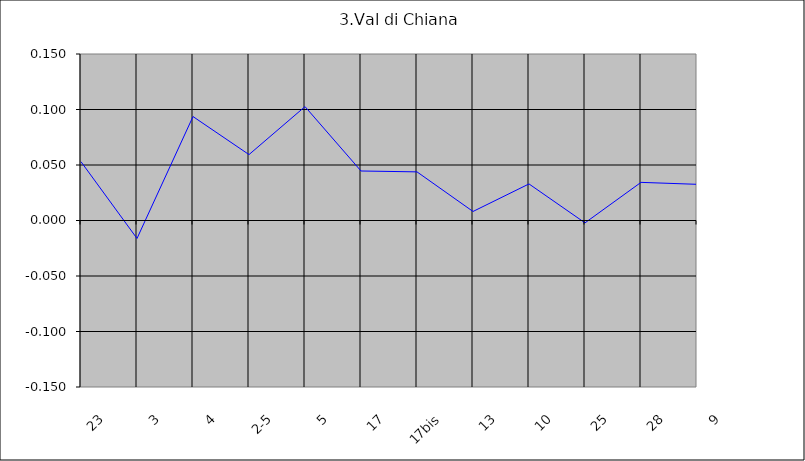
| Category | Val di Chiana |
|---|---|
| 23 | 0.053 |
| 3 | -0.016 |
| 4 | 0.094 |
| 2-5 | 0.059 |
| 5 | 0.103 |
| 17 | 0.045 |
| 17bis | 0.044 |
| 13 | 0.008 |
| 10 | 0.033 |
| 25 | -0.002 |
| 28 | 0.034 |
| 9 | 0.033 |